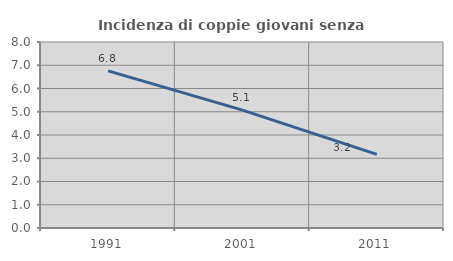
| Category | Incidenza di coppie giovani senza figli |
|---|---|
| 1991.0 | 6.756 |
| 2001.0 | 5.067 |
| 2011.0 | 3.167 |